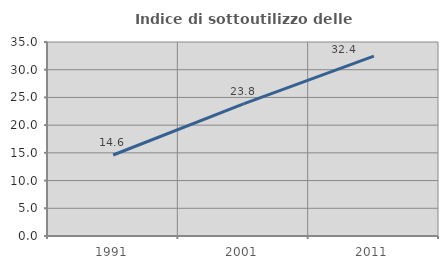
| Category | Indice di sottoutilizzo delle abitazioni  |
|---|---|
| 1991.0 | 14.61 |
| 2001.0 | 23.827 |
| 2011.0 | 32.443 |